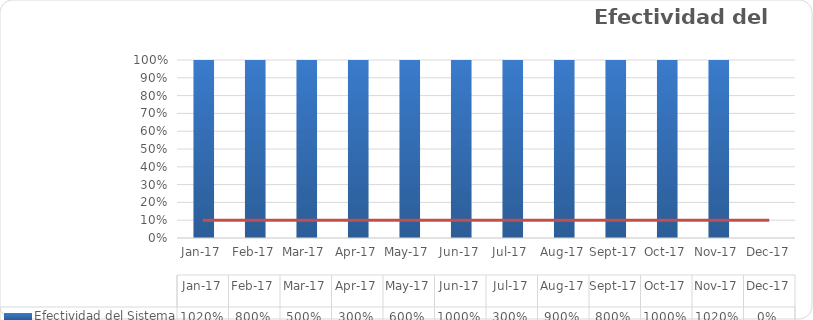
| Category | Efectividad del Sistema |
|---|---|
| 2017-01-01 | 10.2 |
| 2017-02-01 | 8 |
| 2017-03-01 | 5 |
| 2017-04-01 | 3 |
| 2017-05-01 | 6 |
| 2017-06-01 | 10 |
| 2017-07-01 | 3 |
| 2017-08-01 | 9 |
| 2017-09-01 | 8 |
| 2017-10-01 | 10 |
| 2017-11-01 | 10.2 |
| 2017-12-01 | 0 |